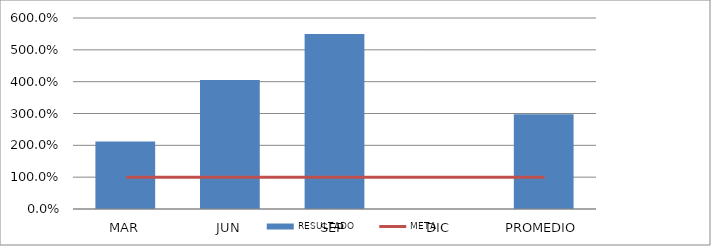
| Category | RESULTADO |
|---|---|
| MAR | 2.12 |
| JUN | 4.056 |
| SEP | 5.5 |
| DIC | 0 |
| PROMEDIO | 2.976 |